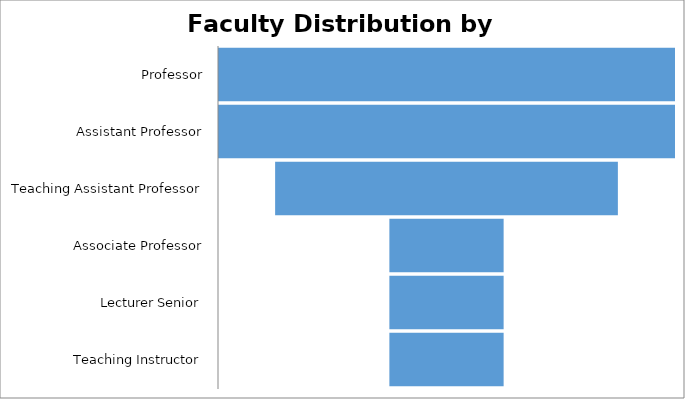
| Category | Series 0 |
|---|---|
| Other non-tenure track | 6 |
| Clinician | 1 |
| Tenure-track | 3 |
| Tenured | 4 |